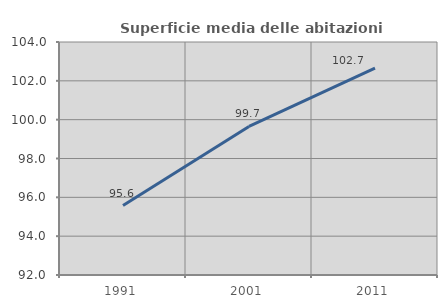
| Category | Superficie media delle abitazioni occupate |
|---|---|
| 1991.0 | 95.575 |
| 2001.0 | 99.653 |
| 2011.0 | 102.652 |